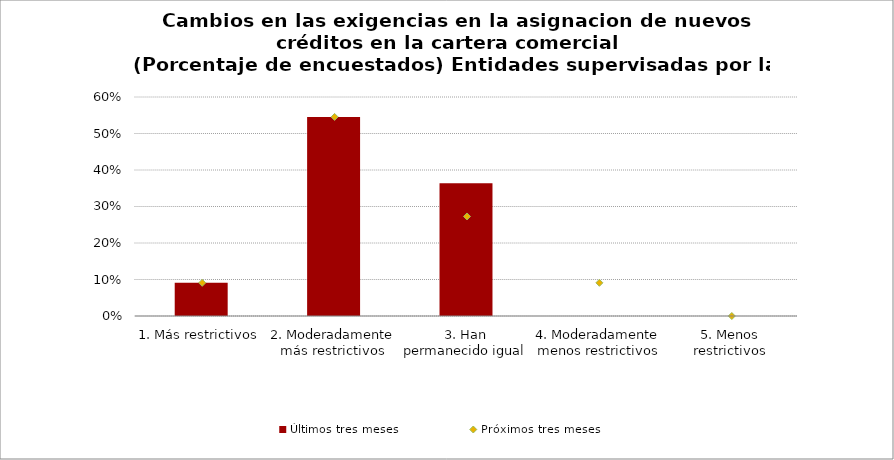
| Category | Últimos tres meses |
|---|---|
| 1. Más restrictivos | 0.091 |
| 2. Moderadamente más restrictivos | 0.545 |
| 3. Han permanecido igual | 0.364 |
| 4. Moderadamente menos restrictivos | 0 |
| 5. Menos restrictivos | 0 |